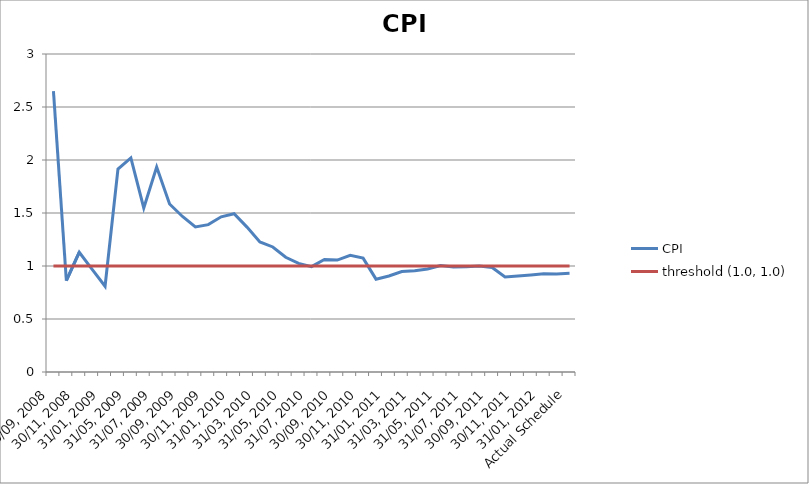
| Category | CPI | threshold (1.0, 1.0) |
|---|---|---|
| 30/09, 2008 | 2.65 | 1 |
| 31/10, 2008 | 0.862 | 1 |
| 30/11, 2008 | 1.13 | 1 |
| 31/12, 2008 | 0.968 | 1 |
| 31/01, 2009 | 0.809 | 1 |
| 30/04, 2009 | 1.915 | 1 |
| 31/05, 2009 | 2.02 | 1 |
| 30/06, 2009 | 1.547 | 1 |
| 31/07, 2009 | 1.934 | 1 |
| 31/08, 2009 | 1.585 | 1 |
| 30/09, 2009 | 1.467 | 1 |
| 31/10, 2009 | 1.369 | 1 |
| 30/11, 2009 | 1.39 | 1 |
| 31/12, 2009 | 1.464 | 1 |
| 31/01, 2010 | 1.493 | 1 |
| 28/02, 2010 | 1.367 | 1 |
| 31/03, 2010 | 1.227 | 1 |
| 30/04, 2010 | 1.179 | 1 |
| 31/05, 2010 | 1.082 | 1 |
| 30/06, 2010 | 1.025 | 1 |
| 31/07, 2010 | 0.994 | 1 |
| 31/08, 2010 | 1.061 | 1 |
| 30/09, 2010 | 1.056 | 1 |
| 31/10, 2010 | 1.101 | 1 |
| 30/11, 2010 | 1.074 | 1 |
| 31/12, 2010 | 0.876 | 1 |
| 31/01, 2011 | 0.906 | 1 |
| 28/02, 2011 | 0.947 | 1 |
| 31/03, 2011 | 0.956 | 1 |
| 30/04, 2011 | 0.972 | 1 |
| 31/05, 2011 | 1.005 | 1 |
| 30/06, 2011 | 0.991 | 1 |
| 31/07, 2011 | 0.994 | 1 |
| 31/08, 2011 | 1.001 | 1 |
| 30/09, 2011 | 0.986 | 1 |
| 31/10, 2011 | 0.896 | 1 |
| 30/11, 2011 | 0.905 | 1 |
| 31/12, 2011 | 0.915 | 1 |
| 31/01, 2012 | 0.926 | 1 |
| 29/02, 2012 | 0.925 | 1 |
| Actual Schedule | 0.931 | 1 |